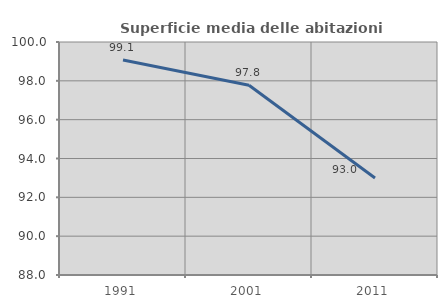
| Category | Superficie media delle abitazioni occupate |
|---|---|
| 1991.0 | 99.076 |
| 2001.0 | 97.773 |
| 2011.0 | 92.998 |